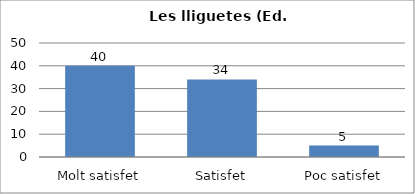
| Category | Series 0 |
|---|---|
| Molt satisfet | 40 |
| Satisfet | 34 |
| Poc satisfet | 5 |